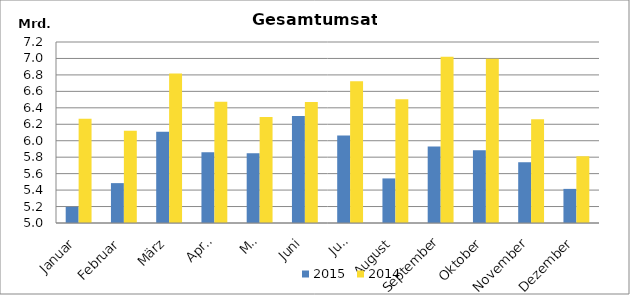
| Category | 2015 | 2014 |
|---|---|---|
| Januar | 5197099.616 | 6266049.438 |
| Februar | 5484696.924 | 6120648.404 |
| März | 6108238.352 | 6817816.857 |
| April | 5858541.072 | 6473391.081 |
| Mai | 5847557.325 | 6288429.95 |
| Juni | 6301521.404 | 6471483.365 |
| Juli | 6062050.925 | 6723543.626 |
| August | 5541836.715 | 6503820.645 |
| September | 5930922.061 | 7022166.65 |
| Oktober | 5883041.939 | 6996691.503 |
| November | 5738502.549 | 6259703.665 |
| Dezember | 5414652.492 | 5810862.426 |